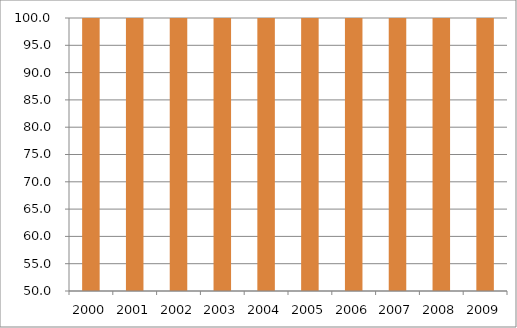
| Category | Brasil |
|---|---|
| 2000.0 | 111.74 |
| 2001.0 | 112.6 |
| 2002.0 | 110.28 |
| 2003.0 | 108.47 |
| 2004.0 | 106.44 |
| 2005.0 | 106.53 |
| 2006.0 | 110.03 |
| 2007.0 | 111.07 |
| 2008.0 | 108.36 |
| 2009.0 | 105.98 |